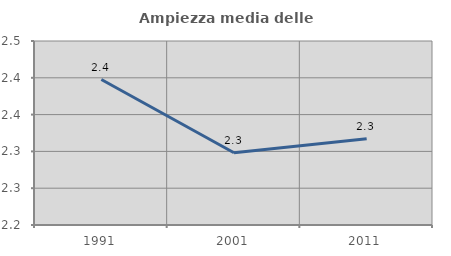
| Category | Ampiezza media delle famiglie |
|---|---|
| 1991.0 | 2.398 |
| 2001.0 | 2.298 |
| 2011.0 | 2.317 |